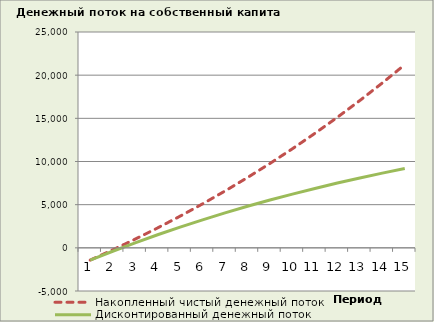
| Category | Накопленный чистый денежный поток | Дисконтированный денежный поток |
|---|---|---|
| 0 | -1420.384 | -1420.384 |
| 1 | -235.97 | -393.753 |
| 2 | 1005.24 | 584.303 |
| 3 | 2305.414 | 1515.683 |
| 4 | 3666.808 | 2402.261 |
| 5 | 5091.768 | 3245.873 |
| 6 | 6582.733 | 4048.317 |
| 7 | 8142.238 | 4811.348 |
| 8 | 9772.924 | 5536.672 |
| 9 | 11477.533 | 6225.95 |
| 10 | 13258.919 | 6880.79 |
| 11 | 15120.05 | 7502.748 |
| 12 | 17064.012 | 8093.329 |
| 13 | 19094.016 | 8653.983 |
| 14 | 21213.399 | 9186.111 |